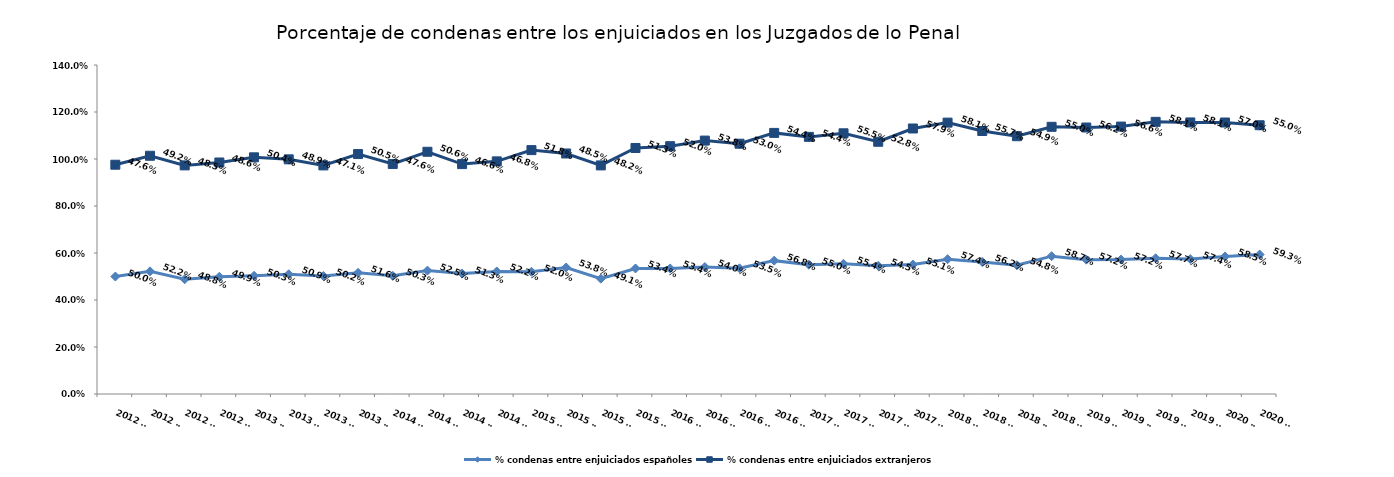
| Category | % condenas entre enjuiciados españoles | % condenas entre enjuiciados extranjeros |
|---|---|---|
| 2012 T1 | 0.5 | 0.476 |
| 2012 T2 | 0.522 | 0.492 |
| 2012 T3 | 0.488 | 0.485 |
| 2012 T4 | 0.499 | 0.486 |
| 2013 T1 | 0.503 | 0.504 |
| 2013 T2 | 0.509 | 0.489 |
| 2013 T3 | 0.502 | 0.471 |
| 2013 T4 | 0.516 | 0.505 |
| 2014 T1 | 0.503 | 0.476 |
| 2014 T2 | 0.525 | 0.506 |
| 2014 T3 | 0.513 | 0.466 |
| 2014 T4 | 0.522 | 0.468 |
| 2015 T1 | 0.52 | 0.518 |
| 2015 T2 | 0.538 | 0.485 |
| 2015 T3 | 0.491 | 0.482 |
| 2015 T4 | 0.534 | 0.513 |
| 2016 T1 | 0.534 | 0.52 |
| 2016 T2 | 0.54 | 0.538 |
| 2016 T3 | 0.535 | 0.53 |
| 2016 T4 | 0.568 | 0.544 |
| 2017 T1 | 0.55 | 0.544 |
| 2017 T2 | 0.554 | 0.555 |
| 2017 T3 | 0.545 | 0.528 |
| 2017 T4 | 0.551 | 0.579 |
| 2018 T1 | 0.574 | 0.581 |
| 2018 T2 | 0.562 | 0.557 |
| 2018 T3 | 0.548 | 0.549 |
| 2018 T4 | 0.587 | 0.55 |
| 2019 T1 | 0.572 | 0.562 |
| 2019 T2 | 0.572 | 0.566 |
| 2019 T3 | 0.577 | 0.581 |
| 2019 T4 | 0.574 | 0.581 |
| 2020 T1 | 0.585 | 0.57 |
| 2020 T2 | 0.593 | 0.55 |